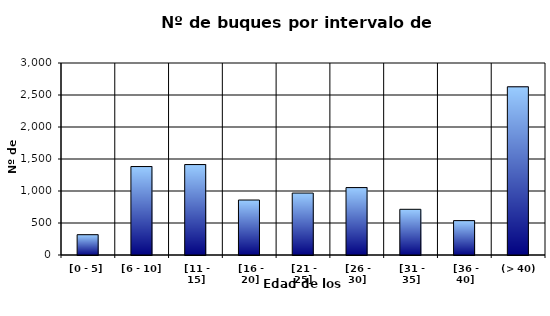
| Category | [0 - 5] |
|---|---|
| [0 - 5] | 317 |
|  [6 - 10] | 1382 |
|  [11 - 15] | 1413 |
|  [16 - 20] | 859 |
|  [21 - 25] | 968 |
|  [26 - 30] | 1053 |
|  [31 - 35] | 714 |
|  [36 - 40] | 537 |
|  (> 40) | 2628 |